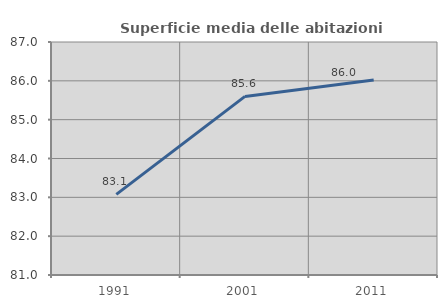
| Category | Superficie media delle abitazioni occupate |
|---|---|
| 1991.0 | 83.075 |
| 2001.0 | 85.599 |
| 2011.0 | 86.02 |